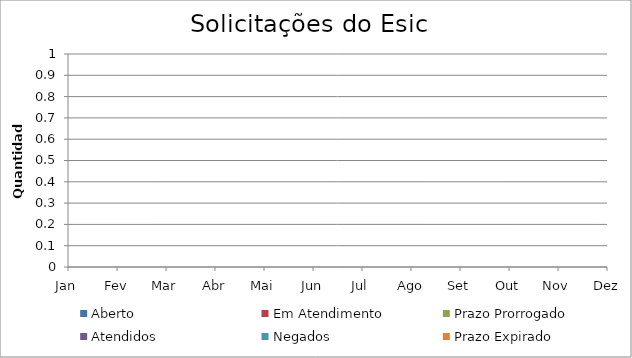
| Category | Aberto | Em Atendimento | Prazo Prorrogado | Atendidos | Negados | Prazo Expirado |
|---|---|---|---|---|---|---|
| Jan | 0 | 0 | 0 | 0 | 0 | 0 |
| Fev | 0 | 0 | 0 | 0 | 0 | 0 |
| Mar | 0 | 0 | 0 | 0 | 0 | 0 |
| Abr | 0 | 0 | 0 | 0 | 0 | 0 |
| Mai | 0 | 0 | 0 | 0 | 0 | 0 |
| Jun | 0 | 0 | 0 | 0 | 0 | 0 |
| Jul | 0 | 0 | 0 | 0 | 0 | 0 |
| Ago | 0 | 0 | 0 | 0 | 0 | 0 |
| Set | 0 | 0 | 0 | 0 | 0 | 0 |
| Out | 0 | 0 | 0 | 0 | 0 | 0 |
| Nov | 0 | 0 | 0 | 0 | 0 | 0 |
| Dez | 0 | 0 | 0 | 0 | 0 | 0 |